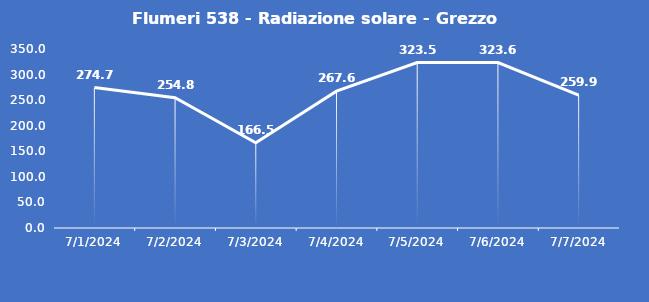
| Category | Flumeri 538 - Radiazione solare - Grezzo (W/m2) |
|---|---|
| 7/1/24 | 274.7 |
| 7/2/24 | 254.8 |
| 7/3/24 | 166.5 |
| 7/4/24 | 267.6 |
| 7/5/24 | 323.5 |
| 7/6/24 | 323.6 |
| 7/7/24 | 259.9 |